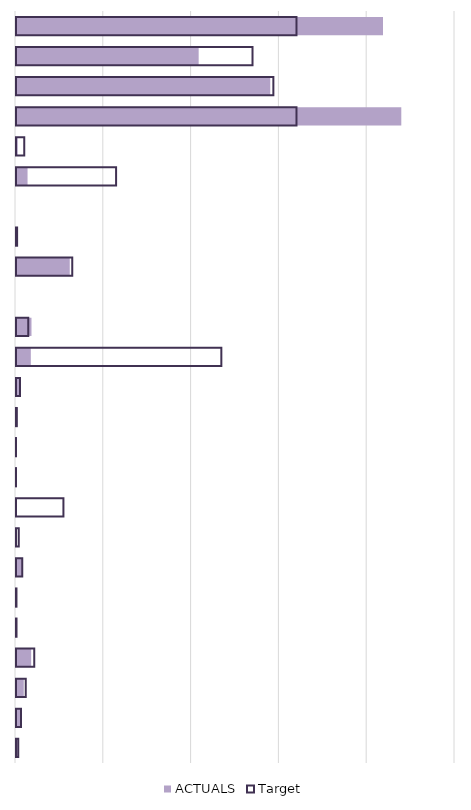
| Category | ACTUALS | Target |
|---|---|---|
| 0 | 8359.874 | 6389.109 |
| 1 | 4160.844 | 5387.456 |
| 2 | 5791.833 | 5862.533 |
| 3 | 8776.695 | 6389.109 |
| 4 | 41 | 190 |
| 5 | 263 | 2280 |
| 6 | 0 | 0 |
| 7 | 32.37 | 25.347 |
| 8 | 1224.341 | 1281.457 |
| 9 | 0 | 0 |
| 10 | 352.939 | 280.122 |
| 11 | 337.641 | 4677.391 |
| 12 | 75.644 | 88.603 |
| 13 | 33.172 | 18.393 |
| 14 | 0.307 | 0.373 |
| 15 | 0.26 | 0.295 |
| 16 | 0 | 1080.374 |
| 17 | 2.252 | 63.034 |
| 18 | 137.208 | 143.019 |
| 19 | 12.362 | 10.613 |
| 20 | 4.75 | 11.629 |
| 21 | 345.675 | 415.293 |
| 22 | 177.085 | 222.144 |
| 23 | 95.576 | 115.267 |
| 24 | 40.643 | 52.535 |